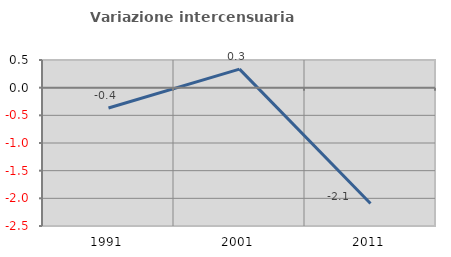
| Category | Variazione intercensuaria annua |
|---|---|
| 1991.0 | -0.367 |
| 2001.0 | 0.335 |
| 2011.0 | -2.095 |